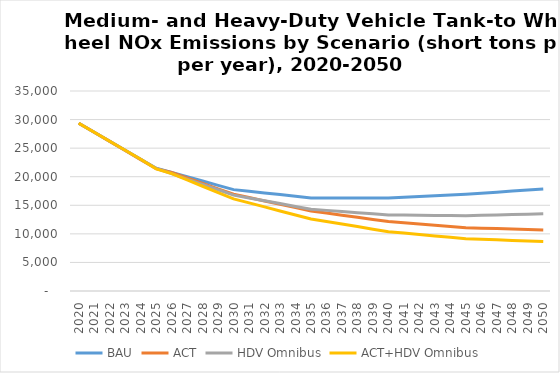
| Category | BAU | ACT | HDV Omnibus | ACT+HDV Omnibus |
|---|---|---|---|---|
| 2020.0 | 29360 | 29360 | 29360 | 29360 |
| 2021.0 | 27790 | 27770 | 27790 | 27790 |
| 2022.0 | 26210 | 26180 | 26210 | 26210 |
| 2023.0 | 24640 | 24580 | 24640 | 24640 |
| 2024.0 | 23060 | 22990 | 23060 | 23060 |
| 2025.0 | 21490 | 21400 | 21470 | 21380 |
| 2026.0 | 20740 | 20740 | 20530 | 20530 |
| 2027.0 | 19990 | 19790 | 19590 | 19430 |
| 2028.0 | 19240 | 18840 | 18660 | 18330 |
| 2029.0 | 18490 | 17880 | 17720 | 17220 |
| 2030.0 | 17740 | 16930 | 16780 | 16120 |
| 2031.0 | 17450 | 16350 | 16290 | 15420 |
| 2032.0 | 17160 | 15760 | 15790 | 14720 |
| 2033.0 | 16870 | 15180 | 15300 | 14010 |
| 2034.0 | 16580 | 14590 | 14800 | 13310 |
| 2035.0 | 16290 | 14010 | 14310 | 12610 |
| 2036.0 | 16290 | 13640 | 14110 | 12160 |
| 2037.0 | 16290 | 13270 | 13910 | 11710 |
| 2038.0 | 16290 | 12890 | 13700 | 11270 |
| 2039.0 | 16290 | 12520 | 13500 | 10820 |
| 2040.0 | 16290 | 12150 | 13300 | 10370 |
| 2041.0 | 16420 | 11940 | 13280 | 10130 |
| 2042.0 | 16540 | 11720 | 13250 | 9890 |
| 2043.0 | 16670 | 11510 | 13230 | 9640 |
| 2044.0 | 16790 | 11290 | 13200 | 9400 |
| 2045.0 | 16920 | 11080 | 13180 | 9160 |
| 2046.0 | 17110 | 11000 | 13250 | 9060 |
| 2047.0 | 17300 | 10920 | 13310 | 8960 |
| 2048.0 | 17480 | 10840 | 13380 | 8850 |
| 2049.0 | 17670 | 10760 | 13440 | 8750 |
| 2050.0 | 17860 | 10680 | 13510 | 8650 |